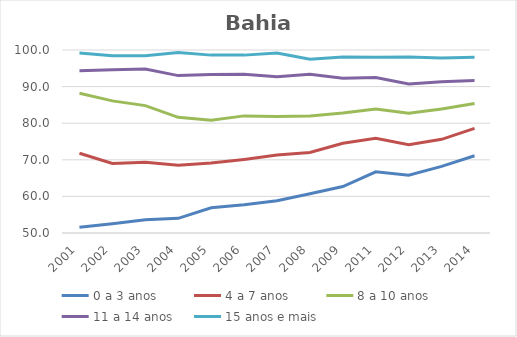
| Category | 0 a 3 anos | 4 a 7 anos | 8 a 10 anos | 11 a 14 anos | 15 anos e mais |
|---|---|---|---|---|---|
| 2001.0 | 51.6 | 71.8 | 88.2 | 94.3 | 99.2 |
| 2002.0 | 52.5 | 69 | 86.1 | 94.6 | 98.4 |
| 2003.0 | 53.6 | 69.3 | 84.8 | 94.8 | 98.4 |
| 2004.0 | 54 | 68.5 | 81.6 | 93 | 99.3 |
| 2005.0 | 56.9 | 69.1 | 80.8 | 93.3 | 98.6 |
| 2006.0 | 57.7 | 70.1 | 82 | 93.4 | 98.6 |
| 2007.0 | 58.8 | 71.3 | 81.8 | 92.7 | 99.2 |
| 2008.0 | 60.7 | 72 | 82 | 93.4 | 97.5 |
| 2009.0 | 62.7 | 74.5 | 82.8 | 92.3 | 98.1 |
| 2011.0 | 66.7 | 75.9 | 83.9 | 92.5 | 98 |
| 2012.0 | 65.8 | 74.1 | 82.7 | 90.7 | 98.1 |
| 2013.0 | 68.2 | 75.6 | 83.9 | 91.3 | 97.8 |
| 2014.0 | 71.1 | 78.6 | 85.4 | 91.7 | 98 |